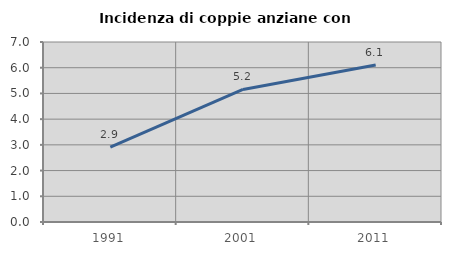
| Category | Incidenza di coppie anziane con figli |
|---|---|
| 1991.0 | 2.907 |
| 2001.0 | 5.155 |
| 2011.0 | 6.108 |